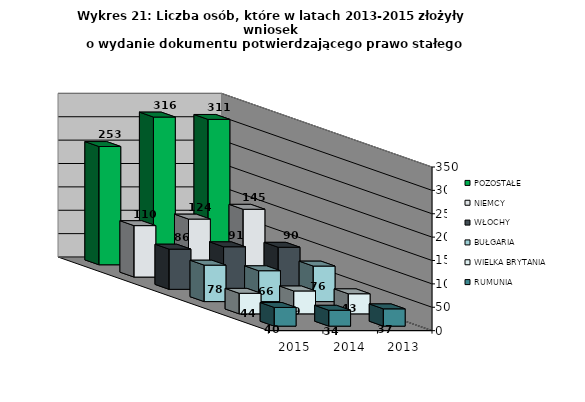
| Category | POZOSTAŁE | NIEMCY | WŁOCHY | BUŁGARIA | WIELKA BRYTANIA | RUMUNIA |
|---|---|---|---|---|---|---|
| 2013.0 | 311 | 145 | 90 | 76 | 43 | 37 |
| 2014.0 | 316 | 124 | 91 | 66 | 49 | 34 |
| 2015.0 | 253 | 110 | 86 | 78 | 44 | 40 |